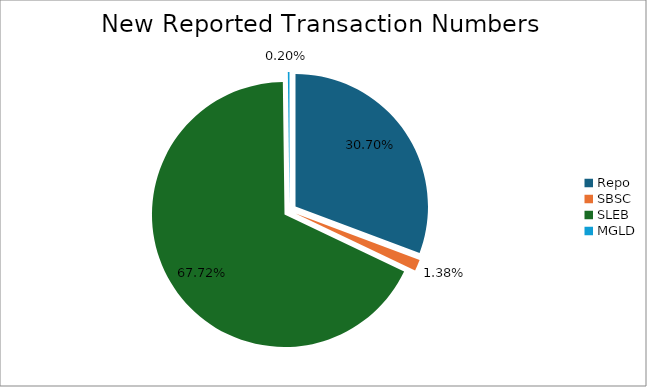
| Category | Series 0 |
|---|---|
| Repo | 462684 |
| SBSC | 20834 |
| SLEB | 1020619 |
| MGLD | 3023 |